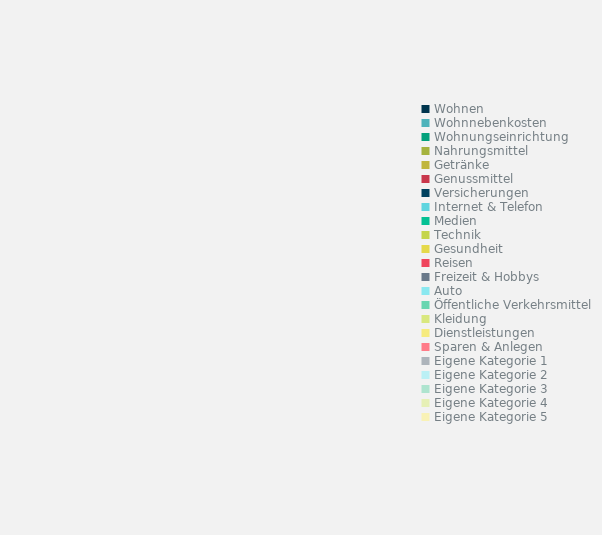
| Category | Series 0 |
|---|---|
| Wohnen | 0 |
| Wohnnebenkosten | 0 |
| Wohnungseinrichtung | 0 |
| Nahrungsmittel | 0 |
| Getränke | 0 |
| Genussmittel | 0 |
| Versicherungen | 0 |
| Internet & Telefon | 0 |
| Medien | 0 |
| Technik | 0 |
| Gesundheit | 0 |
| Reisen | 0 |
| Freizeit & Hobbys | 0 |
| Auto | 0 |
| Öffentliche Verkehrsmittel | 0 |
| Kleidung | 0 |
| Dienstleistungen | 0 |
| Sparen & Anlegen | 0 |
| Eigene Kategorie 1 | 0 |
| Eigene Kategorie 2 | 0 |
| Eigene Kategorie 3 | 0 |
| Eigene Kategorie 4 | 0 |
| Eigene Kategorie 5 | 0 |